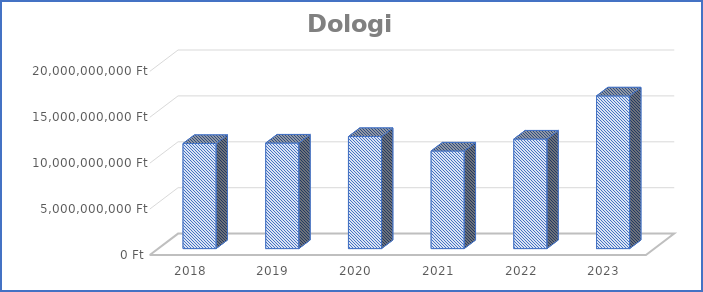
| Category | Dologi kiadások |
|---|---|
| 2018.0 | 11449608652 |
| 2019.0 | 11499372534 |
| 2020.0 | 12208492414 |
| 2021.0 | 10633273898 |
| 2022.0 | 11934219707 |
| 2023.0 | 16631759826 |